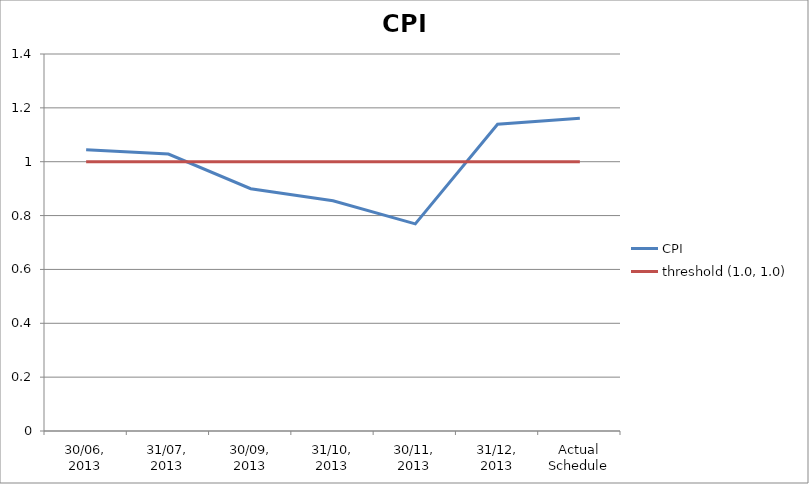
| Category | CPI | threshold (1.0, 1.0) |
|---|---|---|
| 30/06, 2013 | 1.044 | 1 |
| 31/07, 2013 | 1.029 | 1 |
| 30/09, 2013 | 0.9 | 1 |
| 31/10, 2013 | 0.855 | 1 |
| 30/11, 2013 | 0.769 | 1 |
| 31/12, 2013 | 1.139 | 1 |
| Actual Schedule | 1.161 | 1 |